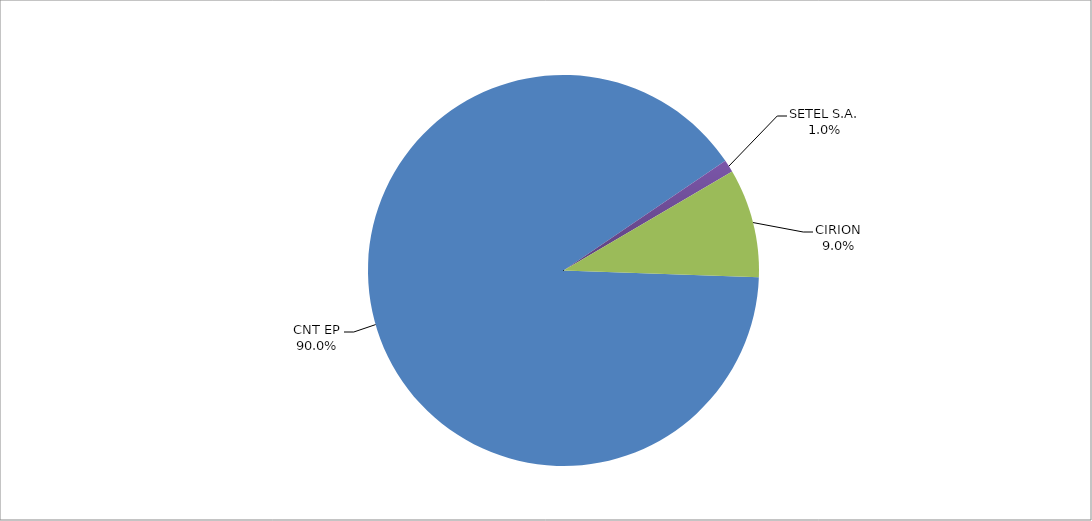
| Category | Series 0 |
|---|---|
| CNT EP | 260 |
| SETEL S.A. | 3 |
| CIRION | 26 |